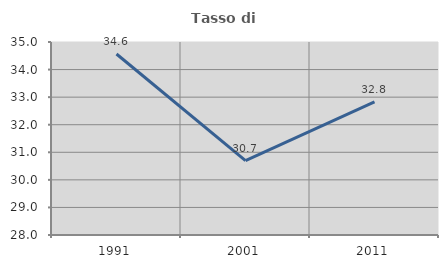
| Category | Tasso di occupazione   |
|---|---|
| 1991.0 | 34.564 |
| 2001.0 | 30.696 |
| 2011.0 | 32.827 |